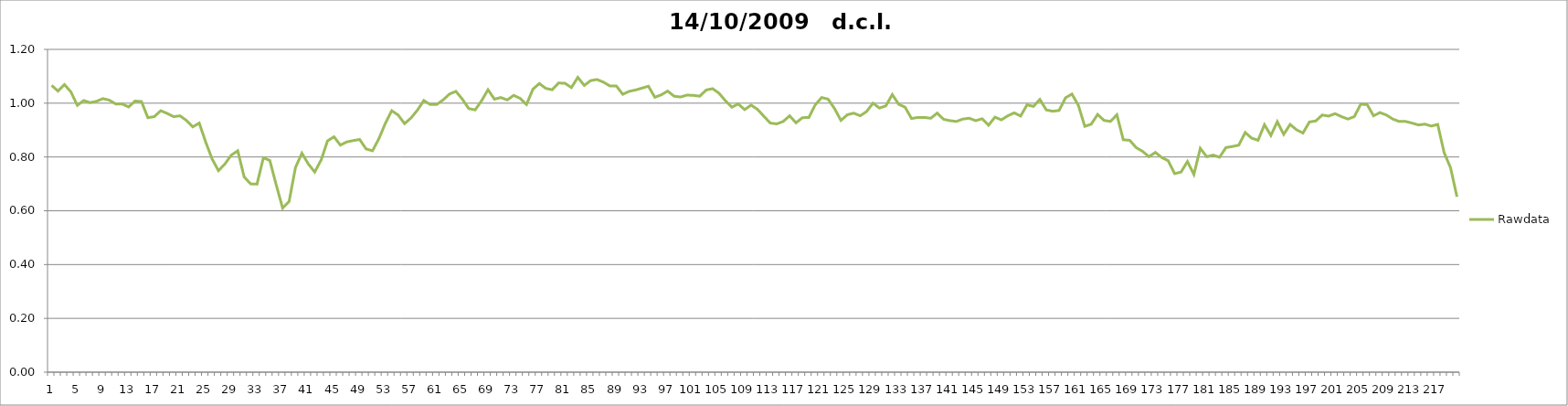
| Category | Rawdata |
|---|---|
| 0 | 1.066 |
| 1 | 1.045 |
| 2 | 1.069 |
| 3 | 1.042 |
| 4 | 0.992 |
| 5 | 1.01 |
| 6 | 1.002 |
| 7 | 1.007 |
| 8 | 1.017 |
| 9 | 1.011 |
| 10 | 0.997 |
| 11 | 0.997 |
| 12 | 0.986 |
| 13 | 1.008 |
| 14 | 1.006 |
| 15 | 0.946 |
| 16 | 0.95 |
| 17 | 0.972 |
| 18 | 0.962 |
| 19 | 0.95 |
| 20 | 0.953 |
| 21 | 0.936 |
| 22 | 0.912 |
| 23 | 0.926 |
| 24 | 0.856 |
| 25 | 0.793 |
| 26 | 0.749 |
| 27 | 0.774 |
| 28 | 0.807 |
| 29 | 0.823 |
| 30 | 0.726 |
| 31 | 0.7 |
| 32 | 0.699 |
| 33 | 0.797 |
| 34 | 0.787 |
| 35 | 0.696 |
| 36 | 0.61 |
| 37 | 0.634 |
| 38 | 0.761 |
| 39 | 0.814 |
| 40 | 0.774 |
| 41 | 0.744 |
| 42 | 0.789 |
| 43 | 0.86 |
| 44 | 0.875 |
| 45 | 0.844 |
| 46 | 0.856 |
| 47 | 0.861 |
| 48 | 0.865 |
| 49 | 0.83 |
| 50 | 0.823 |
| 51 | 0.868 |
| 52 | 0.925 |
| 53 | 0.972 |
| 54 | 0.956 |
| 55 | 0.924 |
| 56 | 0.945 |
| 57 | 0.974 |
| 58 | 1.01 |
| 59 | 0.995 |
| 60 | 0.995 |
| 61 | 1.012 |
| 62 | 1.034 |
| 63 | 1.044 |
| 64 | 1.015 |
| 65 | 0.98 |
| 66 | 0.975 |
| 67 | 1.009 |
| 68 | 1.05 |
| 69 | 1.015 |
| 70 | 1.021 |
| 71 | 1.012 |
| 72 | 1.029 |
| 73 | 1.018 |
| 74 | 0.995 |
| 75 | 1.052 |
| 76 | 1.073 |
| 77 | 1.055 |
| 78 | 1.05 |
| 79 | 1.075 |
| 80 | 1.074 |
| 81 | 1.058 |
| 82 | 1.096 |
| 83 | 1.066 |
| 84 | 1.084 |
| 85 | 1.088 |
| 86 | 1.078 |
| 87 | 1.064 |
| 88 | 1.064 |
| 89 | 1.033 |
| 90 | 1.044 |
| 91 | 1.049 |
| 92 | 1.056 |
| 93 | 1.063 |
| 94 | 1.022 |
| 95 | 1.031 |
| 96 | 1.045 |
| 97 | 1.026 |
| 98 | 1.023 |
| 99 | 1.03 |
| 100 | 1.029 |
| 101 | 1.026 |
| 102 | 1.049 |
| 103 | 1.054 |
| 104 | 1.037 |
| 105 | 1.009 |
| 106 | 0.985 |
| 107 | 0.997 |
| 108 | 0.976 |
| 109 | 0.993 |
| 110 | 0.977 |
| 111 | 0.951 |
| 112 | 0.926 |
| 113 | 0.923 |
| 114 | 0.932 |
| 115 | 0.953 |
| 116 | 0.927 |
| 117 | 0.946 |
| 118 | 0.947 |
| 119 | 0.994 |
| 120 | 1.021 |
| 121 | 1.015 |
| 122 | 0.98 |
| 123 | 0.936 |
| 124 | 0.957 |
| 125 | 0.963 |
| 126 | 0.953 |
| 127 | 0.969 |
| 128 | 1 |
| 129 | 0.982 |
| 130 | 0.99 |
| 131 | 1.032 |
| 132 | 0.996 |
| 133 | 0.985 |
| 134 | 0.943 |
| 135 | 0.947 |
| 136 | 0.947 |
| 137 | 0.944 |
| 138 | 0.963 |
| 139 | 0.94 |
| 140 | 0.935 |
| 141 | 0.932 |
| 142 | 0.941 |
| 143 | 0.944 |
| 144 | 0.935 |
| 145 | 0.942 |
| 146 | 0.918 |
| 147 | 0.948 |
| 148 | 0.938 |
| 149 | 0.953 |
| 150 | 0.964 |
| 151 | 0.952 |
| 152 | 0.994 |
| 153 | 0.988 |
| 154 | 1.014 |
| 155 | 0.975 |
| 156 | 0.97 |
| 157 | 0.973 |
| 158 | 1.02 |
| 159 | 1.034 |
| 160 | 0.992 |
| 161 | 0.914 |
| 162 | 0.922 |
| 163 | 0.958 |
| 164 | 0.936 |
| 165 | 0.932 |
| 166 | 0.957 |
| 167 | 0.864 |
| 168 | 0.862 |
| 169 | 0.835 |
| 170 | 0.821 |
| 171 | 0.801 |
| 172 | 0.817 |
| 173 | 0.798 |
| 174 | 0.786 |
| 175 | 0.738 |
| 176 | 0.744 |
| 177 | 0.783 |
| 178 | 0.735 |
| 179 | 0.832 |
| 180 | 0.801 |
| 181 | 0.807 |
| 182 | 0.799 |
| 183 | 0.835 |
| 184 | 0.839 |
| 185 | 0.844 |
| 186 | 0.891 |
| 187 | 0.87 |
| 188 | 0.862 |
| 189 | 0.92 |
| 190 | 0.88 |
| 191 | 0.931 |
| 192 | 0.884 |
| 193 | 0.921 |
| 194 | 0.901 |
| 195 | 0.889 |
| 196 | 0.93 |
| 197 | 0.934 |
| 198 | 0.956 |
| 199 | 0.952 |
| 200 | 0.961 |
| 201 | 0.95 |
| 202 | 0.941 |
| 203 | 0.95 |
| 204 | 0.996 |
| 205 | 0.995 |
| 206 | 0.953 |
| 207 | 0.965 |
| 208 | 0.956 |
| 209 | 0.941 |
| 210 | 0.932 |
| 211 | 0.932 |
| 212 | 0.926 |
| 213 | 0.919 |
| 214 | 0.922 |
| 215 | 0.915 |
| 216 | 0.921 |
| 217 | 0.816 |
| 218 | 0.76 |
| 219 | 0.652 |